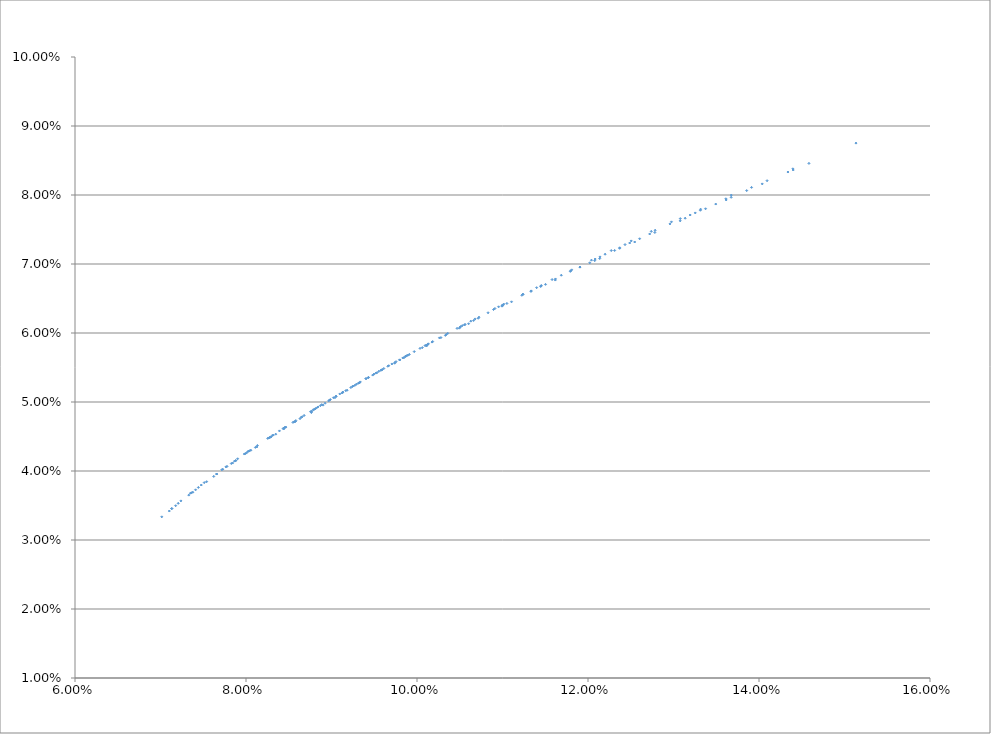
| Category | Series 0 |
|---|---|
| 0.07014946609537798 | 0.033 |
| 0.07349700700183315 | 0.037 |
| 0.07716680465334119 | 0.04 |
| 0.08020567415348155 | 0.043 |
| 0.08434525341638602 | 0.046 |
| 0.08869800808785269 | 0.049 |
| 0.09323408583264851 | 0.053 |
| 0.09738016779628368 | 0.056 |
| 0.10111696899864031 | 0.058 |
| 0.10603371593084904 | 0.061 |
| 0.11105719097003362 | 0.065 |
| 0.11617354981071844 | 0.068 |
| 0.12137104655769836 | 0.071 |
| 0.12546507160283285 | 0.073 |
| 0.1307837427376659 | 0.076 |
| 0.13615922221450308 | 0.079 |
| 0.14037895375903356 | 0.082 |
| 0.1458405396086692 | 0.085 |
| 0.15134304934694967 | 0.088 |
| 0.0753979857468636 | 0.038 |
| 0.07828195207399379 | 0.041 |
| 0.08133381895159716 | 0.044 |
| 0.08453540387845014 | 0.046 |
| 0.08787034329874635 | 0.049 |
| 0.09132402900054142 | 0.051 |
| 0.0943276514725873 | 0.054 |
| 0.09797512191712474 | 0.056 |
| 0.1027947864581691 | 0.059 |
| 0.1066223605632961 | 0.062 |
| 0.11051608815056654 | 0.064 |
| 0.11446921868792251 | 0.067 |
| 0.11905983037420398 | 0.07 |
| 0.12311691650778903 | 0.072 |
| 0.1272172369254375 | 0.074 |
| 0.13195060315854523 | 0.077 |
| 0.1361269537938497 | 0.079 |
| 0.13913117763044347 | 0.081 |
| 0.14396128260975574 | 0.084 |
| 0.08127234047209968 | 0.043 |
| 0.08347775228562443 | 0.045 |
| 0.08575956430101006 | 0.047 |
| 0.08811184116297814 | 0.049 |
| 0.09052909023486624 | 0.051 |
| 0.09403509206634156 | 0.053 |
| 0.0965860139828147 | 0.055 |
| 0.09967832983518587 | 0.057 |
| 0.1034263188494253 | 0.06 |
| 0.10724810367395406 | 0.062 |
| 0.1100115676044179 | 0.064 |
| 0.11453544494687079 | 0.067 |
| 0.11797099835244577 | 0.069 |
| 0.12083827207257165 | 0.071 |
| 0.12433296815828365 | 0.073 |
| 0.12785590510418712 | 0.075 |
| 0.1307953296068174 | 0.077 |
| 0.13317234227112193 | 0.078 |
| 0.13675681554864683 | 0.08 |
| 0.08764678434975517 | 0.048 |
| 0.08901248989137751 | 0.05 |
| 0.09040605085916859 | 0.051 |
| 0.09182619905406335 | 0.052 |
| 0.09429772619469223 | 0.054 |
| 0.09577923566706872 | 0.055 |
| 0.09833888423491162 | 0.056 |
| 0.10094670010336469 | 0.058 |
| 0.10469174710786962 | 0.061 |
| 0.10680116894183596 | 0.062 |
| 0.11014294319453019 | 0.064 |
| 0.11239380841796032 | 0.066 |
| 0.11580194569998017 | 0.068 |
| 0.1180938341702851 | 0.069 |
| 0.12040050594817146 | 0.071 |
| 0.12272112743334689 | 0.072 |
| 0.1250549220416656 | 0.073 |
| 0.12740116584074718 | 0.075 |
| 0.12975918353132185 | 0.076 |
| 0.07238648625142867 | 0.036 |
| 0.07511661273634337 | 0.038 |
| 0.0776525647973826 | 0.041 |
| 0.07980285205497009 | 0.042 |
| 0.08254647889041779 | 0.045 |
| 0.08391010656872483 | 0.046 |
| 0.08582529683580307 | 0.047 |
| 0.08823468722707956 | 0.049 |
| 0.09023345744097619 | 0.051 |
| 0.09274619848362965 | 0.052 |
| 0.09586276023707957 | 0.055 |
| 0.09848167026582455 | 0.056 |
| 0.1011456172951315 | 0.058 |
| 0.10494947461156794 | 0.061 |
| 0.10994280938246692 | 0.064 |
| 0.11503257671630772 | 0.067 |
| 0.12078659157051097 | 0.07 |
| 0.12781727200159473 | 0.075 |
| 0.13855824429426766 | 0.081 |
| 0.07443013363388641 | 0.038 |
| 0.07777780663020957 | 0.041 |
| 0.07991401591274654 | 0.043 |
| 0.08265404914011949 | 0.045 |
| 0.08549140462414971 | 0.047 |
| 0.08841671343903895 | 0.049 |
| 0.08985774135480742 | 0.05 |
| 0.09290107890012853 | 0.053 |
| 0.0949683616619445 | 0.054 |
| 0.09754870047147313 | 0.056 |
| 0.1012540087985199 | 0.058 |
| 0.10503769776025 | 0.061 |
| 0.10830995045363383 | 0.063 |
| 0.1133571139398606 | 0.066 |
| 0.11905983037420398 | 0.07 |
| 0.1260409933184523 | 0.074 |
| 0.13374683923925187 | 0.078 |
| 0.14400353456782877 | 0.084 |
| 0.07207363547421514 | 0.035 |
| 0.07656852268854555 | 0.04 |
| 0.08004657704563625 | 0.043 |
| 0.0827823188581561 | 0.045 |
| 0.08561551646601258 | 0.047 |
| 0.08755379846441176 | 0.049 |
| 0.09052909023486624 | 0.051 |
| 0.09255447018137664 | 0.052 |
| 0.09403509206634156 | 0.053 |
| 0.09611462411954538 | 0.055 |
| 0.09870084408716252 | 0.057 |
| 0.10133369735180416 | 0.058 |
| 0.10510640102713023 | 0.061 |
| 0.10895003980572988 | 0.063 |
| 0.11226497235014998 | 0.065 |
| 0.1179314740229566 | 0.069 |
| 0.12487758405481879 | 0.073 |
| 0.1325454937529091 | 0.077 |
| 0.14338301491045102 | 0.083 |
| 0.07330950365598224 | 0.037 |
| 0.07879394020908381 | 0.041 |
| 0.08293119199694757 | 0.045 |
| 0.08575956430101006 | 0.047 |
| 0.08924677550949696 | 0.05 |
| 0.0912429054102387 | 0.051 |
| 0.09327172003860679 | 0.053 |
| 0.09533113265149999 | 0.054 |
| 0.09741920277170603 | 0.056 |
| 0.09893390314459787 | 0.057 |
| 0.10106929338525567 | 0.058 |
| 0.10262420693548281 | 0.059 |
| 0.1052928304860096 | 0.061 |
| 0.10911426633727471 | 0.064 |
| 0.11239380841796032 | 0.066 |
| 0.11687662640134602 | 0.068 |
| 0.12199988268330296 | 0.071 |
| 0.12958795577781146 | 0.076 |
| 0.07132014351434618 | 0.035 |
| 0.07362913751630985 | 0.037 |
| 0.07476834701655641 | 0.038 |
| 0.07728165736283316 | 0.04 |
| 0.07902405878708153 | 0.042 |
| 0.08030555806194141 | 0.043 |
| 0.08306437874965543 | 0.045 |
| 0.08443016779724534 | 0.046 |
| 0.08679742965170635 | 0.048 |
| 0.08976819107740372 | 0.05 |
| 0.09226515472183185 | 0.052 |
| 0.09481674622116956 | 0.054 |
| 0.09797512191712474 | 0.056 |
| 0.10062639409948061 | 0.058 |
| 0.10332010358998057 | 0.06 |
| 0.10716160127111118 | 0.062 |
| 0.1133312950296397 | 0.066 |
| 0.12020652783645101 | 0.07 |
| 0.07102719737726902 | 0.034 |
| 0.0741021102296807 | 0.037 |
| 0.07656852268854555 | 0.04 |
| 0.07864835350195071 | 0.041 |
| 0.08042676767774679 | 0.043 |
| 0.08318166408152992 | 0.045 |
| 0.08453540387845014 | 0.046 |
| 0.08645717032685785 | 0.048 |
| 0.08885970580703952 | 0.05 |
| 0.09132402900054142 | 0.051 |
| 0.09336971340190035 | 0.053 |
| 0.09592880889407866 | 0.055 |
| 0.09910504672920392 | 0.057 |
| 0.1017616497947227 | 0.059 |
| 0.10556032566254248 | 0.061 |
| 0.10996935147454913 | 0.064 |
| 0.11619434699656642 | 0.068 |
| 0.12369759128624966 | 0.072 |
| 0.13674534577387618 | 0.08 |
| 0.07177153572047472 | 0.035 |
| 0.07622656376573503 | 0.039 |
| 0.07879394020908381 | 0.041 |
| 0.08056920675273968 | 0.043 |
| 0.0827823188581561 | 0.045 |
| 0.08466088587854123 | 0.046 |
| 0.08657992840343864 | 0.048 |
| 0.0879813729443466 | 0.049 |
| 0.0909716274442184 | 0.051 |
| 0.09243947431387946 | 0.052 |
| 0.09553864796391695 | 0.054 |
| 0.09706407211269806 | 0.056 |
| 0.09861034966423528 | 0.057 |
| 0.1018324851714335 | 0.059 |
| 0.10562053628965534 | 0.061 |
| 0.1100115676044179 | 0.064 |
| 0.11449480416590103 | 0.067 |
| 0.12370749726690737 | 0.072 |
| 0.1349405730134633 | 0.079 |
| 0.07378441270884283 | 0.037 |
| 0.07843919797900664 | 0.041 |
| 0.0810992221519865 | 0.043 |
| 0.08441457058583535 | 0.046 |
| 0.08631881469327647 | 0.048 |
| 0.08769472303094647 | 0.049 |
| 0.08966655534952245 | 0.05 |
| 0.09167269479742993 | 0.052 |
| 0.09312981716588457 | 0.053 |
| 0.09519224404560588 | 0.054 |
| 0.09669618845310585 | 0.055 |
| 0.09880871419241828 | 0.057 |
| 0.10035467700247648 | 0.058 |
| 0.10359904590555714 | 0.06 |
| 0.1062925881937055 | 0.062 |
| 0.10954413478679455 | 0.064 |
| 0.11399236750200074 | 0.067 |
| 0.12140120046714846 | 0.071 |
| 0.13314066415315667 | 0.078 |
| 0.07132014351434618 | 0.035 |
| 0.14094470067284023 | 0.082 |
| 0.13136697975848657 | 0.077 |